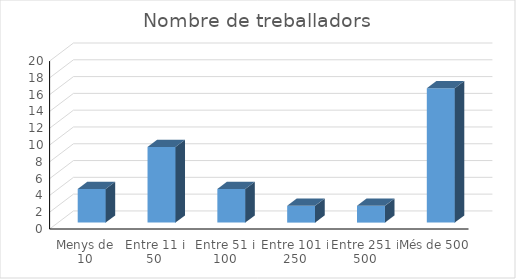
| Category | Series 0 |
|---|---|
| Menys de 10 | 4 |
| Entre 11 i 50 | 9 |
| Entre 51 i 100 | 4 |
| Entre 101 i 250 | 2 |
| Entre 251 i 500 | 2 |
| Més de 500 | 16 |